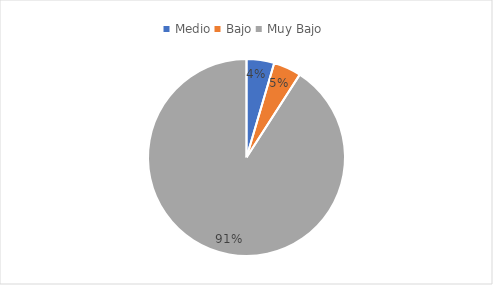
| Category | Series 0 |
|---|---|
| Medio | 0.045 |
| Bajo | 0.045 |
| Muy Bajo | 0.909 |